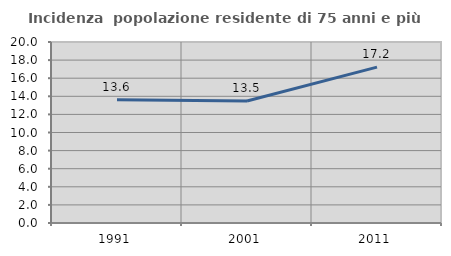
| Category | Incidenza  popolazione residente di 75 anni e più |
|---|---|
| 1991.0 | 13.609 |
| 2001.0 | 13.474 |
| 2011.0 | 17.219 |